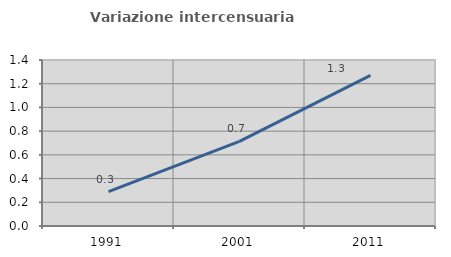
| Category | Variazione intercensuaria annua |
|---|---|
| 1991.0 | 0.29 |
| 2001.0 | 0.714 |
| 2011.0 | 1.271 |